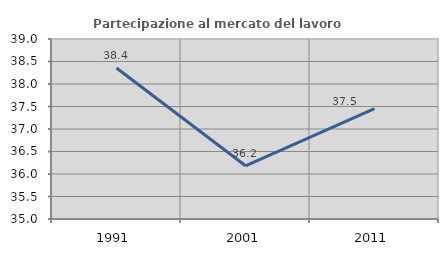
| Category | Partecipazione al mercato del lavoro  femminile |
|---|---|
| 1991.0 | 38.356 |
| 2001.0 | 36.182 |
| 2011.0 | 37.454 |